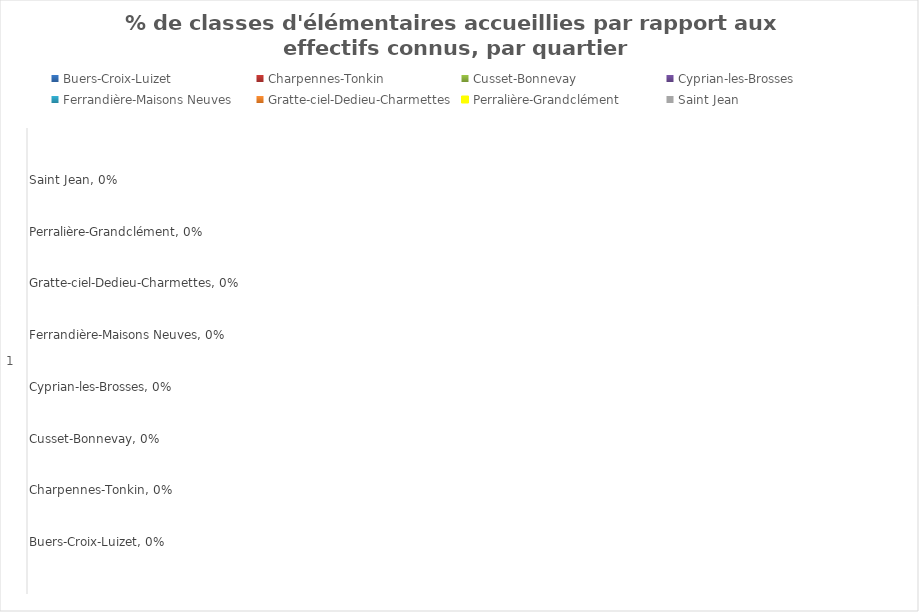
| Category | Buers-Croix-Luizet | Charpennes-Tonkin | Cusset-Bonnevay | Cyprian-les-Brosses | Ferrandière-Maisons Neuves | Gratte-ciel-Dedieu-Charmettes | Perralière-Grandclément | Saint Jean |
|---|---|---|---|---|---|---|---|---|
| 0 | 0 | 0 | 0 | 0 | 0 | 0 | 0 | 0 |